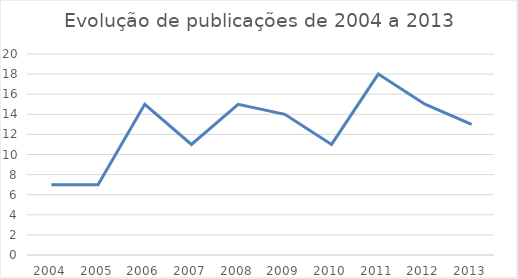
| Category | Series 0 |
|---|---|
| 2004.0 | 7 |
| 2005.0 | 7 |
| 2006.0 | 15 |
| 2007.0 | 11 |
| 2008.0 | 15 |
| 2009.0 | 14 |
| 2010.0 | 11 |
| 2011.0 | 18 |
| 2012.0 | 15 |
| 2013.0 | 13 |